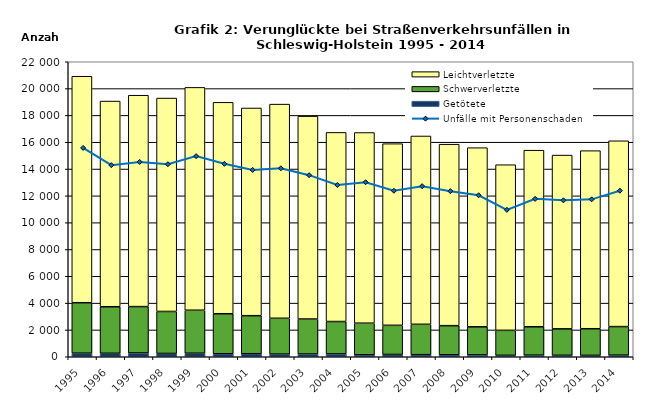
| Category | Getötete | Schwerverletzte | Leichtverletzte |
|---|---|---|---|
| 1995.0 | 268 | 3762 | 16890 |
| 1996.0 | 260 | 3469 | 15340 |
| 1997.0 | 282 | 3459 | 15764 |
| 1998.0 | 245 | 3132 | 15915 |
| 1999.0 | 264 | 3205 | 16619 |
| 2000.0 | 223 | 2985 | 15767 |
| 2001.0 | 226 | 2837 | 15488 |
| 2002.0 | 199 | 2670 | 15971 |
| 2003.0 | 204 | 2611 | 15128 |
| 2004.0 | 212 | 2415 | 14104 |
| 2005.0 | 148 | 2355 | 14219 |
| 2006.0 | 172 | 2173 | 13546 |
| 2007.0 | 156 | 2265 | 14043 |
| 2008.0 | 149 | 2169 | 13535 |
| 2009.0 | 140 | 2092 | 13360 |
| 2010.0 | 108 | 1862 | 12352 |
| 2011.0 | 120 | 2116 | 13169 |
| 2012.0 | 110 | 1970 | 12961 |
| 2013.0 | 103 | 1987 | 13280 |
| 2014.0 | 121 | 2128 | 13858 |